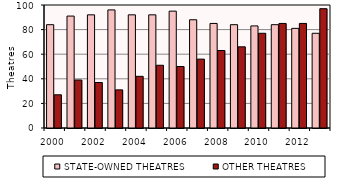
| Category | STATE-OWNED THEATRES | OTHER THEATRES |
|---|---|---|
| 2000.0 | 84 | 27 |
| 2001.0 | 91 | 39 |
| 2002.0 | 92 | 37 |
| 2003.0 | 96 | 31 |
| 2004.0 | 92 | 42 |
| 2005.0 | 92 | 51 |
| 2006.0 | 95 | 50 |
| 2007.0 | 88 | 56 |
| 2008.0 | 85 | 63 |
| 2009.0 | 84 | 66 |
| 2010.0 | 83 | 77 |
| 2011.0 | 84 | 85 |
| 2012.0 | 81 | 85 |
| 2013.0 | 77 | 97 |